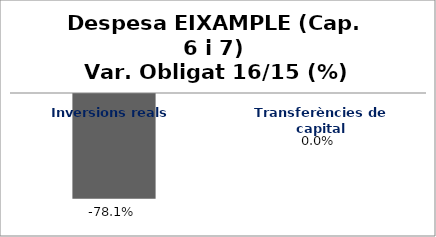
| Category | Series 0 |
|---|---|
| Inversions reals | -0.781 |
| Transferències de capital | 0 |